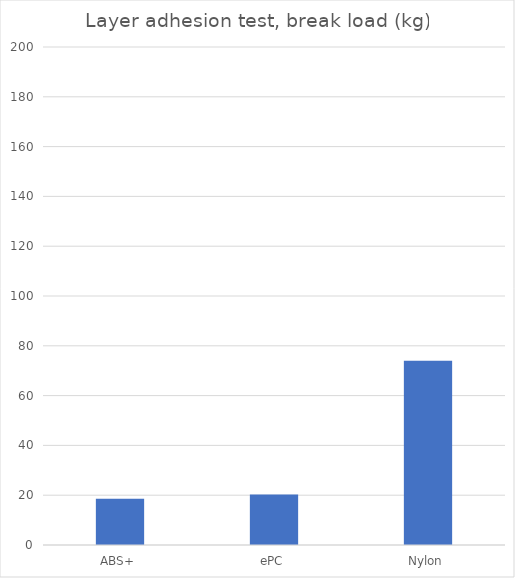
| Category | Average |
|---|---|
| ABS+ | 18.6 |
| ePC | 20.3 |
| Nylon | 74 |